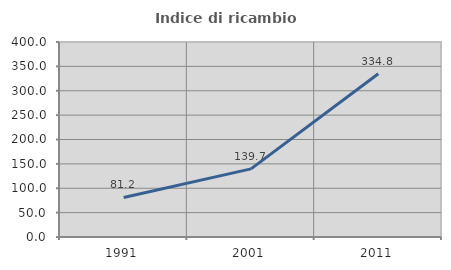
| Category | Indice di ricambio occupazionale  |
|---|---|
| 1991.0 | 81.153 |
| 2001.0 | 139.686 |
| 2011.0 | 334.829 |